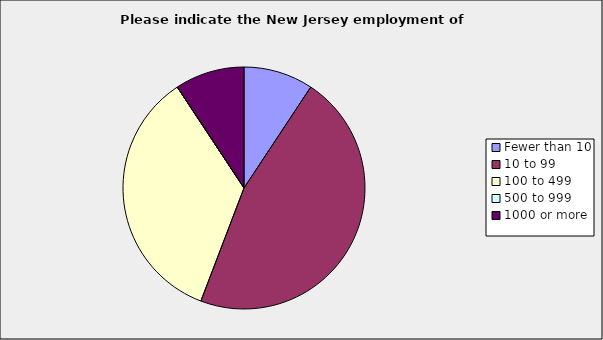
| Category | Series 0 |
|---|---|
| Fewer than 10 | 0.093 |
| 10 to 99 | 0.465 |
| 100 to 499 | 0.349 |
| 500 to 999 | 0 |
| 1000 or more | 0.093 |